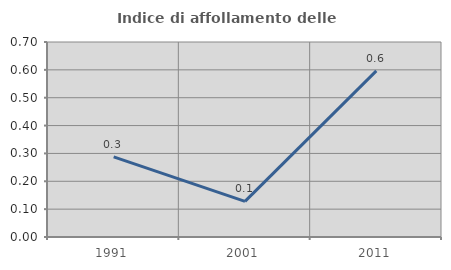
| Category | Indice di affollamento delle abitazioni  |
|---|---|
| 1991.0 | 0.288 |
| 2001.0 | 0.128 |
| 2011.0 | 0.596 |